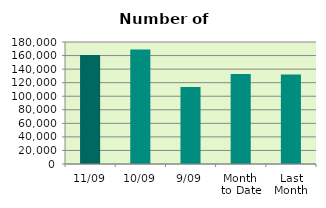
| Category | Series 0 |
|---|---|
| 11/09 | 160970 |
| 10/09 | 168862 |
| 9/09 | 113478 |
| Month 
to Date | 132729.5 |
| Last
Month | 132110.818 |